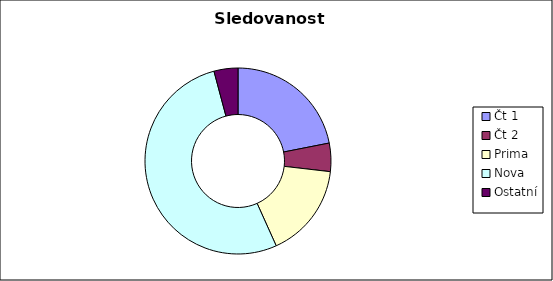
| Category | Počet |
|---|---|
| Čt 1 | 2000000 |
| Čt 2 | 450000 |
| Prima | 1500000 |
| Nova | 4800000 |
| Ostatní | 380000 |